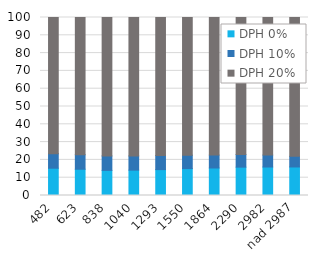
| Category | DPH 0% | DPH 10% | DPH 20% |
|---|---|---|---|
| 482 | 15.324 | 8.183 | 76.493 |
| 623 | 14.752 | 8.188 | 77.06 |
| 838 | 14.102 | 8.154 | 77.744 |
| 1040 | 14.239 | 7.984 | 77.777 |
| 1293 | 14.541 | 7.883 | 77.577 |
| 1550 | 15.128 | 7.522 | 77.351 |
| 1864 | 15.452 | 7.232 | 77.316 |
| 2290 | 15.925 | 7.122 | 76.953 |
| 2982 | 16.003 | 6.695 | 77.302 |
| nad 2987 | 16.029 | 5.959 | 78.013 |